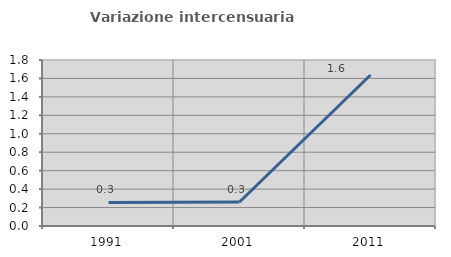
| Category | Variazione intercensuaria annua |
|---|---|
| 1991.0 | 0.255 |
| 2001.0 | 0.26 |
| 2011.0 | 1.637 |